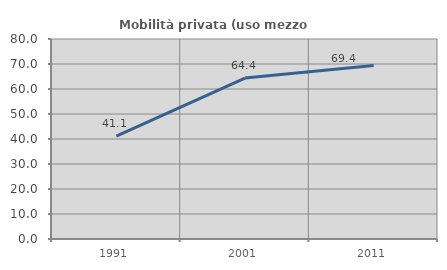
| Category | Mobilità privata (uso mezzo privato) |
|---|---|
| 1991.0 | 41.146 |
| 2001.0 | 64.377 |
| 2011.0 | 69.438 |